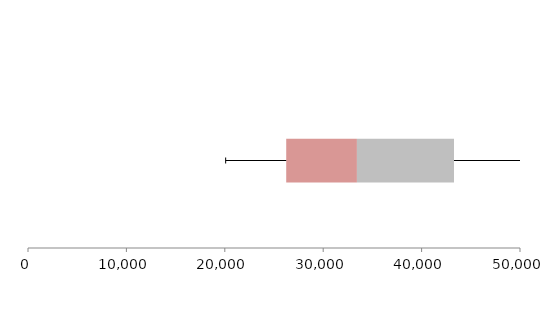
| Category | Series 1 | Series 2 | Series 3 |
|---|---|---|---|
| 0 | 26241.486 | 7185.552 | 9865.468 |